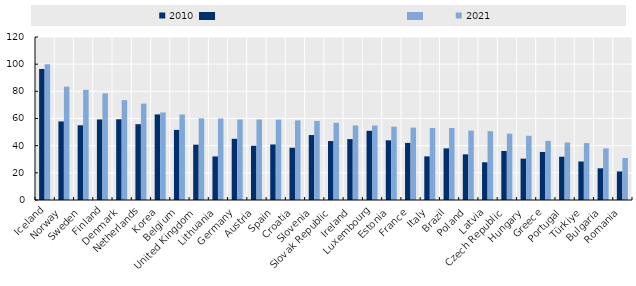
| Category | 2010 | 2021 |
|---|---|---|
| Iceland | 96.446 | 100 |
| Norway | 57.843 | 83.471 |
| Sweden | 54.998 | 81.103 |
| Finland | 59.314 | 78.508 |
| Denmark | 59.442 | 73.545 |
| Netherlands | 55.807 | 70.933 |
| Korea | 63.021 | 64.447 |
| Belgium | 51.608 | 62.965 |
| United Kingdom | 40.725 | 60.137 |
| Lithuania | 32.08 | 60.006 |
| Germany | 45.051 | 59.324 |
| Austria | 39.957 | 59.273 |
| Spain | 40.87 | 59.139 |
| Croatia | 38.455 | 58.592 |
| Slovenia | 47.81 | 58.237 |
| Slovak Republic | 43.409 | 56.849 |
| Ireland | 44.844 | 54.87 |
| Luxembourg | 50.932 | 54.848 |
| Estonia | 43.928 | 54.015 |
| France | 42.044 | 53.288 |
| Italy | 32.126 | 53.022 |
| Brazil | 38 | 53 |
| Poland | 33.604 | 51.09 |
| Latvia | 27.769 | 50.673 |
| Czech Republic | 36.088 | 48.868 |
| Hungary | 30.447 | 47.264 |
| Greece | 35.371 | 43.505 |
| Portugal | 31.865 | 42.283 |
| Türkiye | 28.357 | 41.884 |
| Bulgaria | 23.32 | 37.956 |
| Romania | 21.018 | 30.94 |